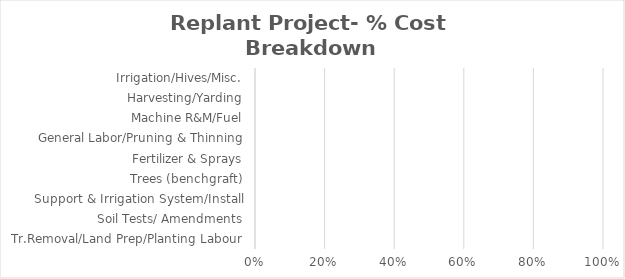
| Category | Series 3 |
|---|---|
| Tr.Removal/Land Prep/Planting Labour | 0 |
| Soil Tests/ Amendments | 0 |
| Support & Irrigation System/Install | 0 |
| Trees (benchgraft) | 0 |
| Fertilizer & Sprays | 0 |
| General Labor/Pruning & Thinning | 0 |
| Machine R&M/Fuel | 0 |
| Harvesting/Yarding | 0 |
| Irrigation/Hives/Misc. | 0 |